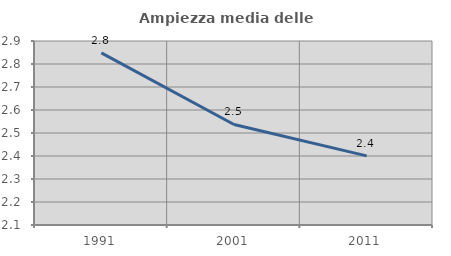
| Category | Ampiezza media delle famiglie |
|---|---|
| 1991.0 | 2.849 |
| 2001.0 | 2.537 |
| 2011.0 | 2.4 |